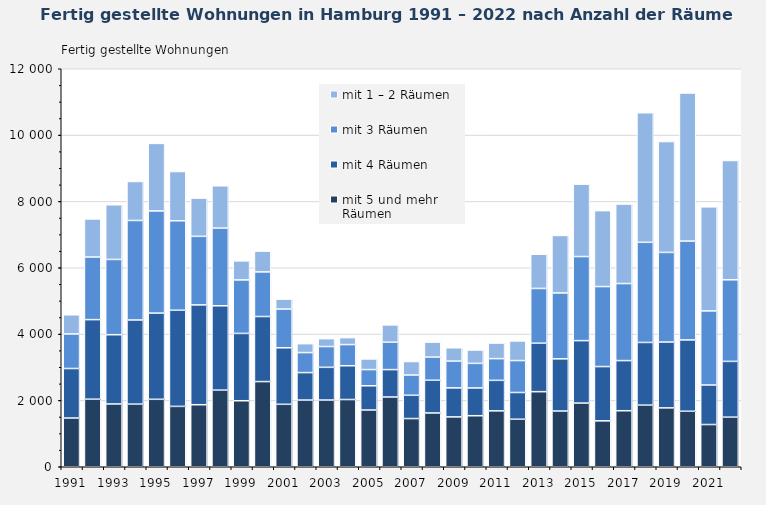
| Category | mit 5 und mehr Räumen | mit 4 Räumen | mit 3 Räumen | mit 1 – 2 Räumen |
|---|---|---|---|---|
| 1991.0 | 1469 | 1493 | 1042 | 578 |
| 1992.0 | 2037 | 2399 | 1887 | 1148 |
| 1993.0 | 1893 | 2088 | 2270 | 1648 |
| 1994.0 | 1888 | 2537 | 3001 | 1175 |
| 1995.0 | 2034 | 2599 | 3080 | 2037 |
| 1996.0 | 1820 | 2899 | 2698 | 1485 |
| 1997.0 | 1870 | 3010 | 2067 | 1152 |
| 1998.0 | 2310 | 2544 | 2341 | 1276 |
| 1999.0 | 1990 | 2030 | 1614 | 574 |
| 2000.0 | 2568 | 1962 | 1345 | 627 |
| 2001.0 | 1883 | 1704 | 1168 | 299 |
| 2002.0 | 2011 | 828 | 603 | 269 |
| 2003.0 | 2012 | 986 | 627 | 237 |
| 2004.0 | 2027 | 1019 | 638 | 209 |
| 2005.0 | 1711 | 731 | 488 | 321 |
| 2006.0 | 2103 | 826 | 826 | 523 |
| 2007.0 | 1453 | 702 | 610 | 408 |
| 2008.0 | 1622 | 986 | 698 | 452 |
| 2009.0 | 1503 | 875 | 807 | 402 |
| 2010.0 | 1539 | 837 | 741 | 403 |
| 2011.0 | 1685 | 920 | 655 | 469 |
| 2012.0 | 1433 | 806 | 963 | 591 |
| 2013.0 | 2264 | 1461 | 1651 | 1031 |
| 2014.0 | 1680 | 1574 | 1986 | 1734 |
| 2015.0 | 1920 | 1883 | 2535 | 2183 |
| 2016.0 | 1385 | 1636 | 2412 | 2289 |
| 2017.0 | 1689 | 1512 | 2323 | 2396 |
| 2018.0 | 1858 | 1890 | 3019 | 3907 |
| 2019.0 | 1775 | 1985 | 2703 | 3342 |
| 2020.0 | 1673 | 2151 | 2980 | 4465 |
| 2021.0 | 1273 | 1192 | 2234 | 3137 |
| 2022.0 | 1495 | 1682 | 2460 | 3597 |